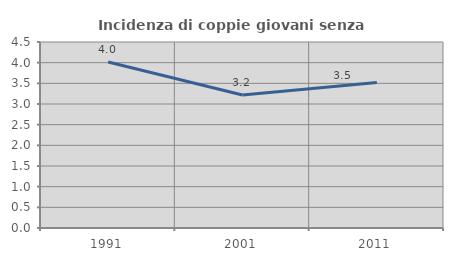
| Category | Incidenza di coppie giovani senza figli |
|---|---|
| 1991.0 | 4.015 |
| 2001.0 | 3.22 |
| 2011.0 | 3.523 |